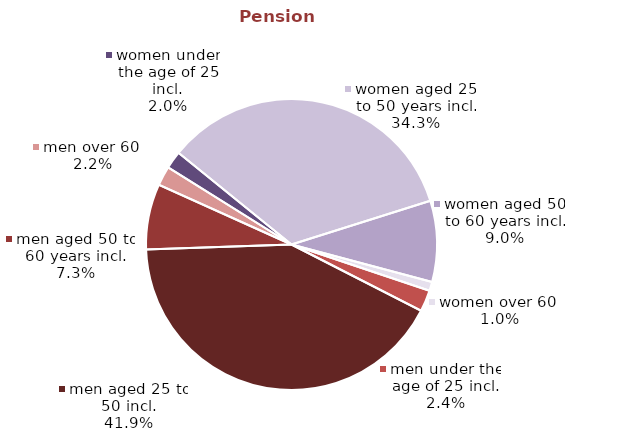
| Category | Series 0 |
|---|---|
| women under the age of 25 incl. | 1792976.71 |
| women aged 25 to 50 years incl. | 31336135.78 |
| women aged 50 to 60 years incl. | 8231949.09 |
| women over 60  | 911246.02 |
| men under the age of 25 incl. | 2173461.14 |
| men aged 25 to 50 incl. | 38326615.88 |
| men aged 50 to 60 years incl. | 6643310.09 |
| men over 60  | 1968364.32 |